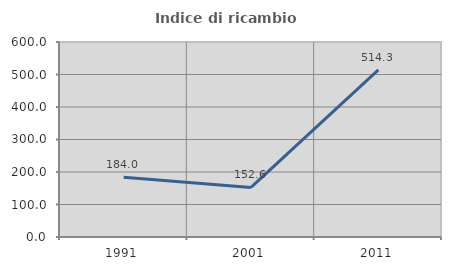
| Category | Indice di ricambio occupazionale  |
|---|---|
| 1991.0 | 184 |
| 2001.0 | 152.632 |
| 2011.0 | 514.286 |